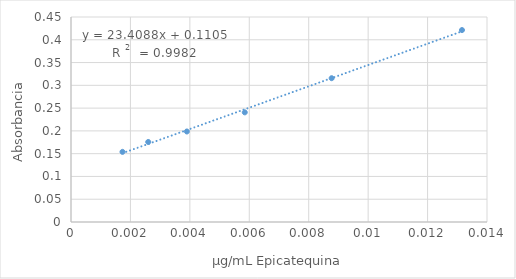
| Category | Series 0 |
|---|---|
| 0.013157894736842105 | 0.421 |
| 0.008771929824561405 | 0.316 |
| 0.0058479532163742695 | 0.241 |
| 0.0038986354775828462 | 0.199 |
| 0.002599090318388564 | 0.176 |
| 0.0017327268789257093 | 0.154 |